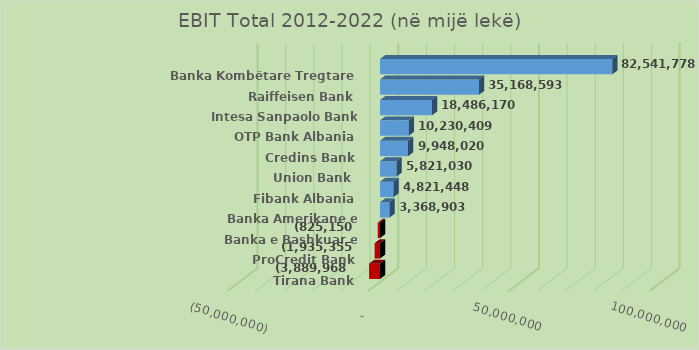
| Category | EBIT Total 2012-2022 (në mijë lekë) |
|---|---|
| Tirana Bank | -3889968 |
| ProCredit Bank | -1935355 |
| Banka e Bashkuar e Shipërisë | -825150 |
| Banka Amerikane e Investimeve | 3368903 |
| Fibank Albania | 4821448 |
| Union Bank  | 5821030 |
| Credins Bank | 9948020 |
| OTP Bank Albania | 10230409 |
| Intesa Sanpaolo Bank Albania | 18486170 |
| Raiffeisen Bank | 35168593 |
| Banka Kombëtare Tregtare | 82541778 |